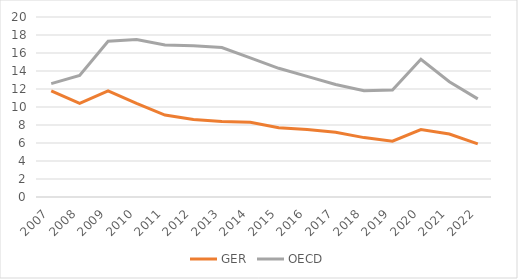
| Category | GER | OECD |
|---|---|---|
| 2007.0 | 11.8 | 12.6 |
| 2008.0 | 10.4 | 13.5 |
| 2009.0 | 11.8 | 17.3 |
| 2010.0 | 10.4 | 17.5 |
| 2011.0 | 9.1 | 16.9 |
| 2012.0 | 8.6 | 16.8 |
| 2013.0 | 8.4 | 16.6 |
| 2014.0 | 8.3 | 15.45 |
| 2015.0 | 7.7 | 14.3 |
| 2016.0 | 7.5 | 13.4 |
| 2017.0 | 7.2 | 12.5 |
| 2018.0 | 6.6 | 11.8 |
| 2019.0 | 6.2 | 11.9 |
| 2020.0 | 7.5 | 15.3 |
| 2021.0 | 7 | 12.8 |
| 2022.0 | 5.9 | 10.9 |